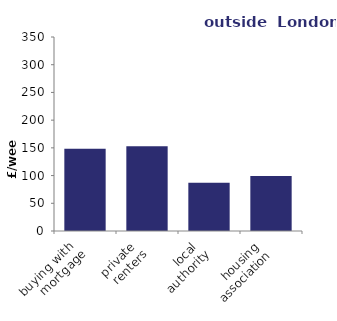
| Category | outside  London  |
|---|---|
| buying with 
mortgage | 148.554 |
| private 
renters | 152.934 |
| local 
authority | 87.256 |
| housing 
association | 99.269 |